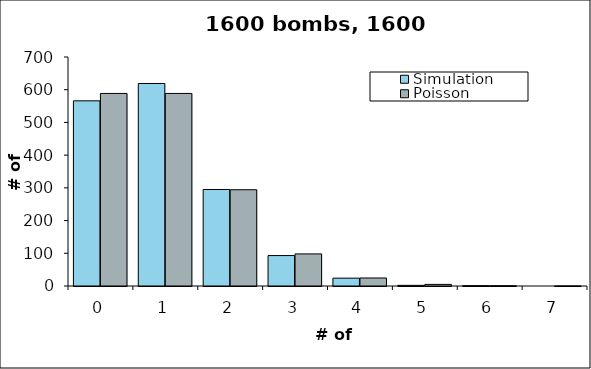
| Category | Simulation | Poisson |
|---|---|---|
| 0.0 | 566 | 588.607 |
| 1.0 | 619 | 588.607 |
| 2.0 | 295 | 294.304 |
| 3.0 | 93 | 98.101 |
| 4.0 | 24 | 24.525 |
| 5.0 | 2 | 4.905 |
| 6.0 | 1 | 0.818 |
| 7.0 | 0 | 0.117 |